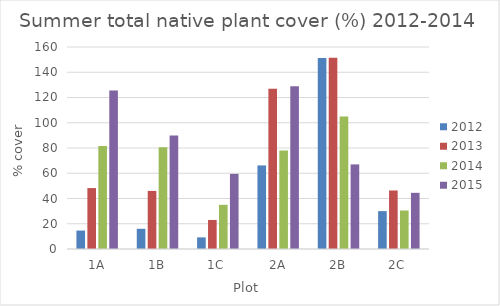
| Category | 2012 | 2013 | 2014 | 2015 |
|---|---|---|---|---|
| 1A | 14.6 | 48.25 | 81.5 | 125.5 |
| 1B | 16 | 46 | 80.5 | 90 |
| 1C | 9.2 | 23 | 35 | 59.5 |
| 2A | 66.2 | 127 | 78 | 129 |
| 2B | 151.2 | 151.5 | 105 | 67 |
| 2C | 30 | 46.35 | 30.5 | 44.5 |